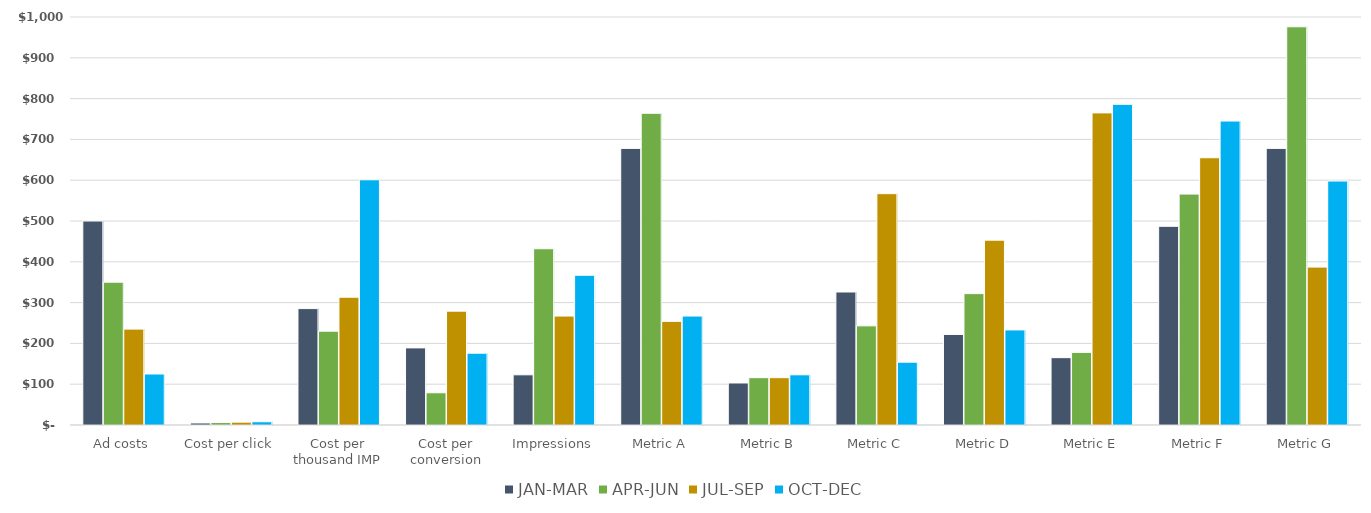
| Category | JAN-MAR | APR-JUN | JUL-SEP | OCT-DEC |
|---|---|---|---|---|
| Ad costs | 500 | 350 | 235 | 125 |
| Cost per click | 5 | 6 | 7 | 8 |
| Cost per thousand IMP | 285.28 | 229.92 | 313.19 | 601.05 |
| Cost per conversion | 189 | 79 | 279 | 176 |
| Impressions | 123 | 432 | 267 | 367 |
| Metric A | 678 | 764 | 254 | 267 |
| Metric B | 103 | 116 | 116 | 123 |
| Metric C | 326 | 243 | 567 | 154 |
| Metric D | 222 | 322 | 453 | 233 |
| Metric E | 165 | 178 | 765 | 786 |
| Metric F | 487 | 566 | 655 | 745 |
| Metric G | 678 | 976 | 387 | 598 |